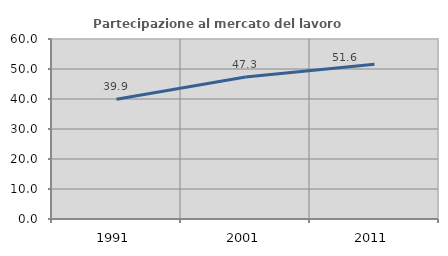
| Category | Partecipazione al mercato del lavoro  femminile |
|---|---|
| 1991.0 | 39.904 |
| 2001.0 | 47.328 |
| 2011.0 | 51.554 |